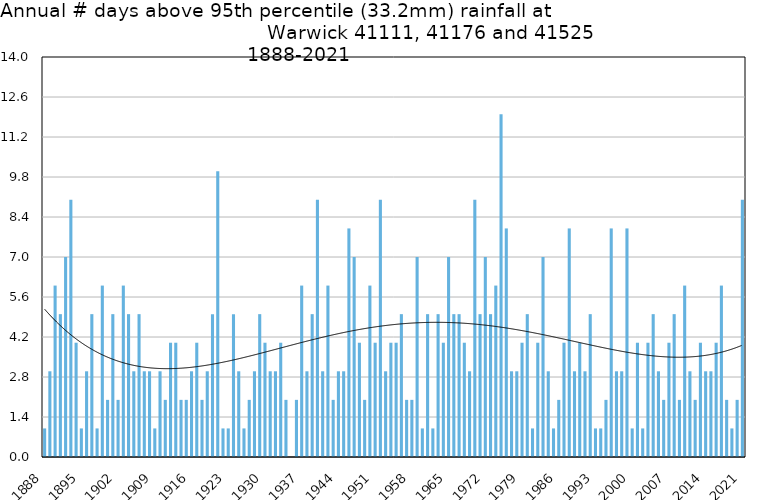
| Category | Annual # days above 95th percentile |
|---|---|
| 1888 | 1 |
| 1889 | 3 |
| 1890 | 6 |
| 1891 | 5 |
| 1892 | 7 |
| 1893 | 9 |
| 1894 | 4 |
| 1895 | 1 |
| 1896 | 3 |
| 1897 | 5 |
| 1898 | 1 |
| 1899 | 6 |
| 1900 | 2 |
| 1901 | 5 |
| 1902 | 2 |
| 1903 | 6 |
| 1904 | 5 |
| 1905 | 3 |
| 1906 | 5 |
| 1907 | 3 |
| 1908 | 3 |
| 1909 | 1 |
| 1910 | 3 |
| 1911 | 2 |
| 1912 | 4 |
| 1913 | 4 |
| 1914 | 2 |
| 1915 | 2 |
| 1916 | 3 |
| 1917 | 4 |
| 1918 | 2 |
| 1919 | 3 |
| 1920 | 5 |
| 1921 | 10 |
| 1922 | 1 |
| 1923 | 1 |
| 1924 | 5 |
| 1925 | 3 |
| 1926 | 1 |
| 1927 | 2 |
| 1928 | 3 |
| 1929 | 5 |
| 1930 | 4 |
| 1931 | 3 |
| 1932 | 3 |
| 1933 | 4 |
| 1934 | 2 |
| 1935 | 0 |
| 1936 | 2 |
| 1937 | 6 |
| 1938 | 3 |
| 1939 | 5 |
| 1940 | 9 |
| 1941 | 3 |
| 1942 | 6 |
| 1943 | 2 |
| 1944 | 3 |
| 1945 | 3 |
| 1946 | 8 |
| 1947 | 7 |
| 1948 | 4 |
| 1949 | 2 |
| 1950 | 6 |
| 1951 | 4 |
| 1952 | 9 |
| 1953 | 3 |
| 1954 | 4 |
| 1955 | 4 |
| 1956 | 5 |
| 1957 | 2 |
| 1958 | 2 |
| 1959 | 7 |
| 1960 | 1 |
| 1961 | 5 |
| 1962 | 1 |
| 1963 | 5 |
| 1964 | 4 |
| 1965 | 7 |
| 1966 | 5 |
| 1967 | 5 |
| 1968 | 4 |
| 1969 | 3 |
| 1970 | 9 |
| 1971 | 5 |
| 1972 | 7 |
| 1973 | 5 |
| 1974 | 6 |
| 1975 | 12 |
| 1976 | 8 |
| 1977 | 3 |
| 1978 | 3 |
| 1979 | 4 |
| 1980 | 5 |
| 1981 | 1 |
| 1982 | 4 |
| 1983 | 7 |
| 1984 | 3 |
| 1985 | 1 |
| 1986 | 2 |
| 1987 | 4 |
| 1988 | 8 |
| 1989 | 3 |
| 1990 | 4 |
| 1991 | 3 |
| 1992 | 5 |
| 1993 | 1 |
| 1994 | 1 |
| 1995 | 2 |
| 1996 | 8 |
| 1997 | 3 |
| 1998 | 3 |
| 1999 | 8 |
| 2000 | 1 |
| 2001 | 4 |
| 2002 | 1 |
| 2003 | 4 |
| 2004 | 5 |
| 2005 | 3 |
| 2006 | 2 |
| 2007 | 4 |
| 2008 | 5 |
| 2009 | 2 |
| 2010 | 6 |
| 2011 | 3 |
| 2012 | 2 |
| 2013 | 4 |
| 2014 | 3 |
| 2015 | 3 |
| 2016 | 4 |
| 2017 | 6 |
| 2018 | 2 |
| 2019 | 1 |
| 2020 | 2 |
| 2021 | 9 |